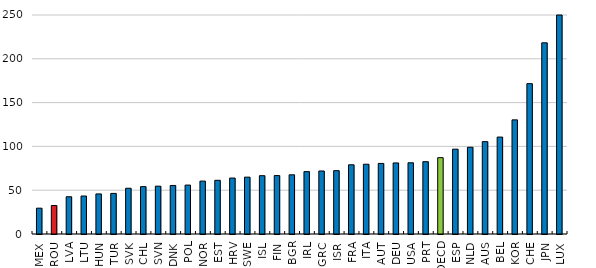
| Category | Series 0 |
|---|---|
| MEX | 29.468 |
| ROU | 32.509 |
| LVA | 42.514 |
| LTU | 43.359 |
| HUN | 45.734 |
| TUR | 46.335 |
| SVK | 52.225 |
| CHL | 54.059 |
| SVN | 54.593 |
| DNK | 55.414 |
| POL | 55.833 |
| NOR | 60.386 |
| EST | 61.299 |
| HRV | 63.868 |
| SWE | 64.896 |
| ISL | 66.565 |
| FIN | 66.68 |
| BGR | 67.57 |
| IRL | 71.213 |
| GRC | 71.928 |
| ISR | 72.319 |
| FRA | 79.016 |
| ITA | 79.653 |
| AUT | 80.568 |
| DEU | 81.112 |
| USA | 81.314 |
| PRT | 82.561 |
| OECD | 87.13 |
| ESP | 96.845 |
| NLD | 99.004 |
| AUS | 105.422 |
| BEL | 110.648 |
| KOR | 130.288 |
| CHE | 171.622 |
| JPN | 218.225 |
| LUX | 399.887 |